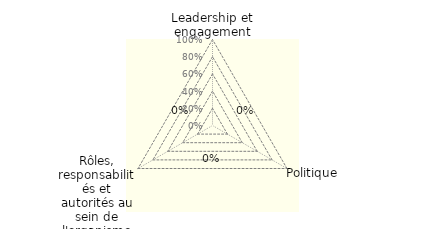
| Category | Art 5 |
|---|---|
| 0 | 0 |
| 1 | 0 |
| 2 | 0 |